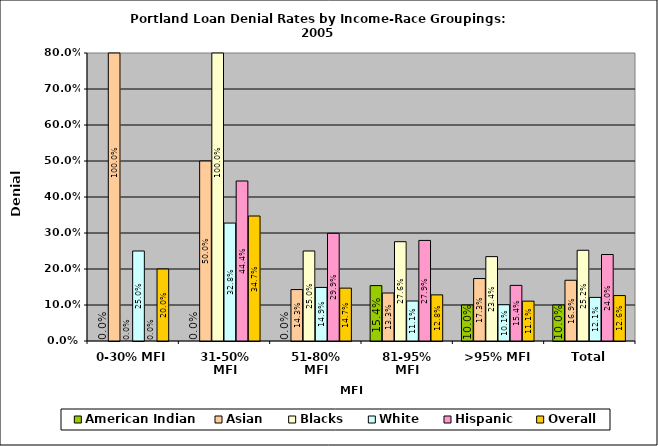
| Category | American Indian | Asian | Blacks | White | Hispanic | Overall |
|---|---|---|---|---|---|---|
| 0-30% MFI | 0 | 1 | 0 | 0.25 | 0 | 0.2 |
| 31-50% MFI | 0 | 0.5 | 1 | 0.328 | 0.444 | 0.347 |
| 51-80% MFI | 0 | 0.143 | 0.25 | 0.149 | 0.299 | 0.147 |
| 81-95% MFI | 0.154 | 0.133 | 0.276 | 0.111 | 0.279 | 0.128 |
| >95% MFI | 0.1 | 0.173 | 0.234 | 0.101 | 0.154 | 0.111 |
| Total | 0.1 | 0.169 | 0.252 | 0.121 | 0.24 | 0.126 |